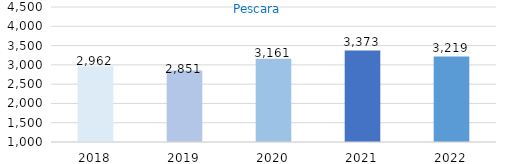
| Category | Series 0 |
|---|---|
| 2018.0 | 2962 |
| 2019.0 | 2851 |
| 2020.0 | 3161 |
| 2021.0 | 3373 |
| 2022.0 | 3219 |